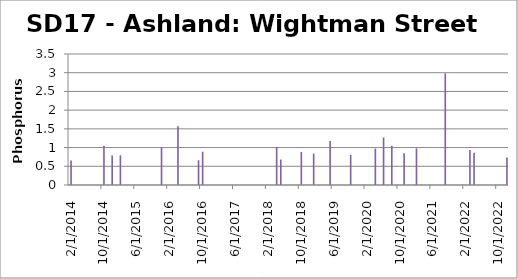
| Category | Phosphorus (mg/L) |
|---|---|
| 2/12/14 | 0.657 |
| 10/8/14 | 1.05 |
| 12/11/14 | 0.791 |
| 2/2/15 | 0.794 |
| 12/10/15 | 1 |
| 4/14/16 | 1.57 |
| 9/7/16 | 0.661 |
| 10/14/16 | 0.889 |
| 4/12/18 | 1.02 |
| 5/16/18 | 0.68 |
| 10/24/18 | 0.883 |
| 1/17/19 | 0.84 |
| 5/16/19 | 1.177 |
| 10/17/19 | 0.802 |
| 4/22/20 | 0.972 |
| 6/23/20 | 1.27 |
| 8/20/20 | 1.048 |
| 11/18/20 | 0.845 |
| 2/19/21 | 0.979 |
| 9/14/21 | 2.981 |
| 3/3/22 | 0.936 |
| 4/13/22 | 0.862 |
| 9/15/22 | 0 |
| 12/30/22 | 0.738 |